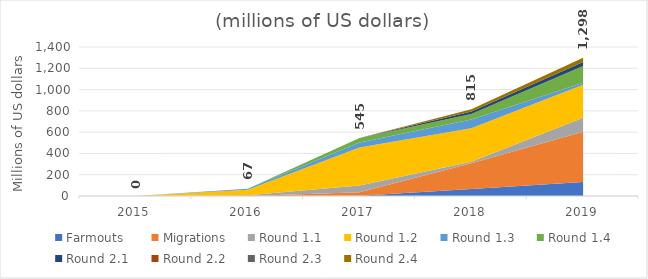
| Category | Series 10 |
|---|---|
| 2015.0 | 0.026 |
| 2016.0 | 67.154 |
| 2017.0 | 545.326 |
| 2018.0 | 815.452 |
| 2019.0 | 1297.971 |